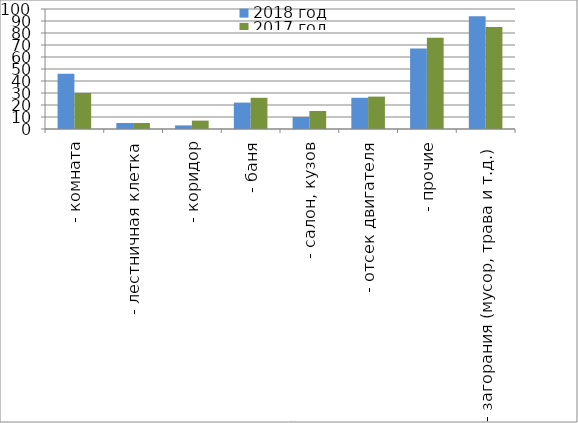
| Category | 2018 год | 2017 год |
|---|---|---|
|  - комната | 46 | 30 |
|  - лестничная клетка | 5 | 5 |
|  - коридор | 3 | 7 |
|  - баня | 22 | 26 |
|  - салон, кузов | 10 | 15 |
|  - отсек двигателя | 26 | 27 |
| - прочие | 67 | 76 |
| - загорания (мусор, трава и т.д.)  | 94 | 85 |